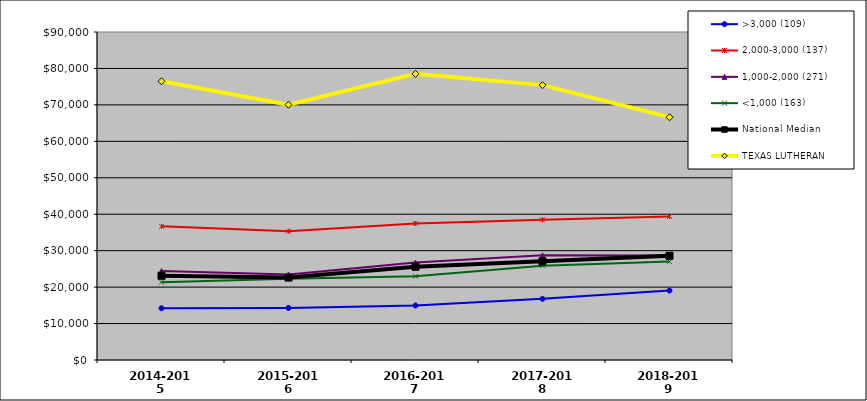
| Category | >3,000 (109) | 2,000-3,000 (137) | 1,000-2,000 (271) | <1,000 (163) | National Median | TEXAS LUTHERAN |
|---|---|---|---|---|---|---|
| 2014-2015 | 14183.739 | 36676.33 | 24404.071 | 21365.42 | 23117.708 | 76478.341 |
| 2015-2016 | 14292.591 | 35341.227 | 23471.125 | 22318.79 | 22619.893 | 70047.888 |
| 2016-2017 | 14956.771 | 37460.797 | 26722.887 | 22974.089 | 25581.053 | 78508.712 |
| 2017-2018 | 16785.806 | 38464.074 | 28710.478 | 25856.622 | 27067.87 | 75423 |
| 2018-2019 | 19058.159 | 39375.444 | 28644.584 | 27010.721 | 28604.166 | 66606.85 |